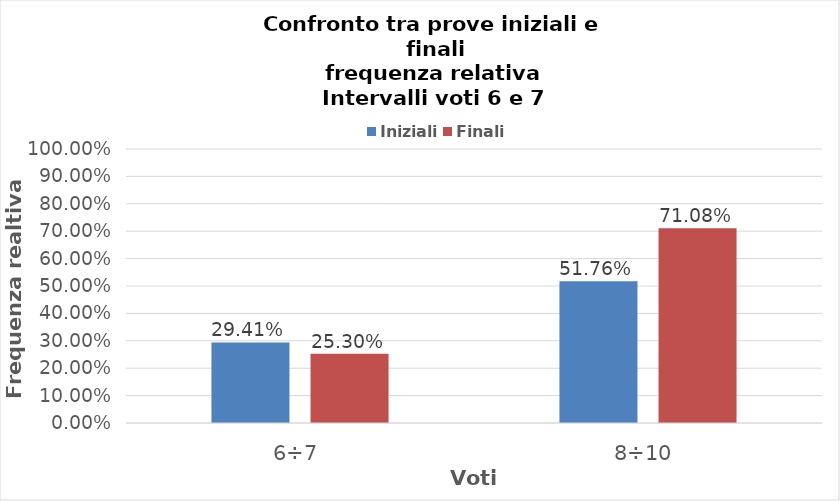
| Category | Iniziali | Finali |
|---|---|---|
| 6÷7 | 0.294 | 0.253 |
| 8÷10 | 0.518 | 0.711 |